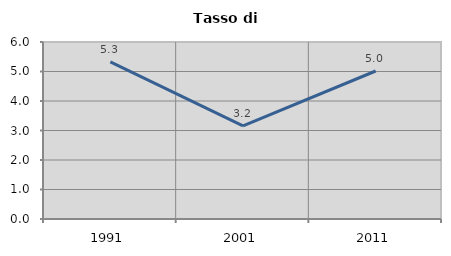
| Category | Tasso di disoccupazione   |
|---|---|
| 1991.0 | 5.328 |
| 2001.0 | 3.155 |
| 2011.0 | 5.017 |